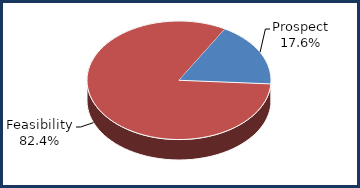
| Category | Series 0 |
|---|---|
| Prospect | 0.176 |
| Feasibility | 0.824 |